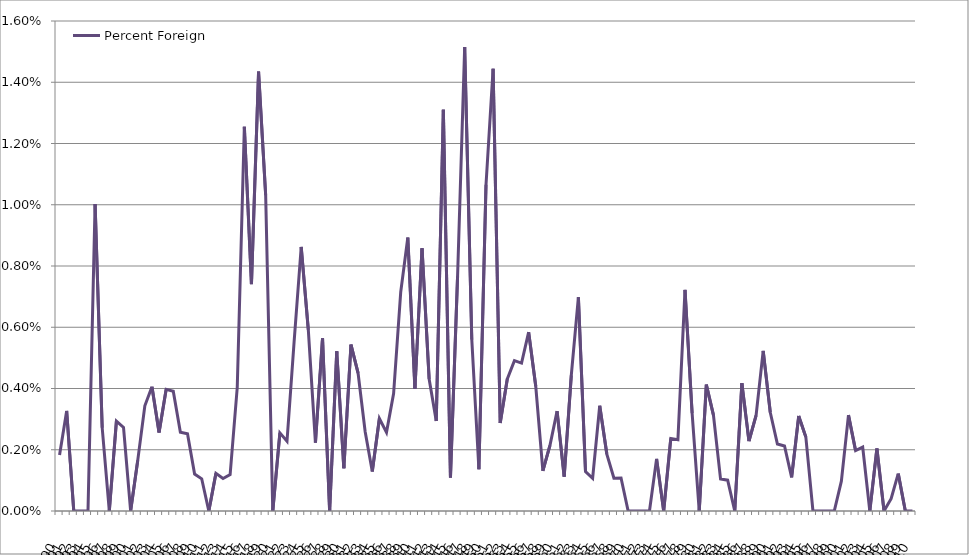
| Category | Percent Foreign |
|---|---|
| 1890.0 | 0.002 |
| 1891.0 | 0.003 |
| 1892.0 | 0 |
| 1893.0 | 0 |
| 1894.0 | 0 |
| 1895.0 | 0.01 |
| 1896.0 | 0.003 |
| 1897.0 | 0 |
| 1898.0 | 0.003 |
| 1899.0 | 0.003 |
| 1900.0 | 0 |
| 1901.0 | 0.002 |
| 1902.0 | 0.003 |
| 1903.0 | 0.004 |
| 1904.0 | 0.003 |
| 1905.0 | 0.004 |
| 1906.0 | 0.004 |
| 1907.0 | 0.003 |
| 1908.0 | 0.003 |
| 1909.0 | 0.001 |
| 1910.0 | 0.001 |
| 1911.0 | 0 |
| 1912.0 | 0.001 |
| 1913.0 | 0.001 |
| 1914.0 | 0.001 |
| 1915.0 | 0.004 |
| 1916.0 | 0.013 |
| 1917.0 | 0.007 |
| 1918.0 | 0.014 |
| 1919.0 | 0.01 |
| 1920.0 | 0 |
| 1921.0 | 0.003 |
| 1922.0 | 0.002 |
| 1923.0 | 0.006 |
| 1924.0 | 0.009 |
| 1925.0 | 0.006 |
| 1926.0 | 0.002 |
| 1927.0 | 0.006 |
| 1928.0 | 0 |
| 1929.0 | 0.005 |
| 1930.0 | 0.001 |
| 1931.0 | 0.005 |
| 1932.0 | 0.005 |
| 1933.0 | 0.003 |
| 1934.0 | 0.001 |
| 1935.0 | 0.003 |
| 1936.0 | 0.003 |
| 1937.0 | 0.004 |
| 1938.0 | 0.007 |
| 1939.0 | 0.009 |
| 1940.0 | 0.004 |
| 1941.0 | 0.009 |
| 1942.0 | 0.004 |
| 1943.0 | 0.003 |
| 1944.0 | 0.013 |
| 1945.0 | 0.001 |
| 1946.0 | 0.008 |
| 1947.0 | 0.015 |
| 1948.0 | 0.006 |
| 1949.0 | 0.001 |
| 1950.0 | 0.011 |
| 1951.0 | 0.014 |
| 1952.0 | 0.003 |
| 1953.0 | 0.004 |
| 1954.0 | 0.005 |
| 1955.0 | 0.005 |
| 1956.0 | 0.006 |
| 1957.0 | 0.004 |
| 1958.0 | 0.001 |
| 1959.0 | 0.002 |
| 1960.0 | 0.003 |
| 1961.0 | 0.001 |
| 1962.0 | 0.004 |
| 1963.0 | 0.007 |
| 1964.0 | 0.001 |
| 1965.0 | 0.001 |
| 1966.0 | 0.003 |
| 1967.0 | 0.002 |
| 1968.0 | 0.001 |
| 1969.0 | 0.001 |
| 1970.0 | 0 |
| 1971.0 | 0 |
| 1972.0 | 0 |
| 1973.0 | 0 |
| 1974.0 | 0.002 |
| 1975.0 | 0 |
| 1976.0 | 0.002 |
| 1977.0 | 0.002 |
| 1978.0 | 0.007 |
| 1979.0 | 0.003 |
| 1980.0 | 0 |
| 1981.0 | 0.004 |
| 1982.0 | 0.003 |
| 1983.0 | 0.001 |
| 1984.0 | 0.001 |
| 1985.0 | 0 |
| 1986.0 | 0.004 |
| 1987.0 | 0.002 |
| 1988.0 | 0.003 |
| 1989.0 | 0.005 |
| 1990.0 | 0.003 |
| 1991.0 | 0.002 |
| 1992.0 | 0.002 |
| 1993.0 | 0.001 |
| 1994.0 | 0.003 |
| 1995.0 | 0.002 |
| 1996.0 | 0 |
| 1997.0 | 0 |
| 1998.0 | 0 |
| 1999.0 | 0 |
| 2000.0 | 0.001 |
| 2001.0 | 0.003 |
| 2002.0 | 0.002 |
| 2003.0 | 0.002 |
| 2004.0 | 0 |
| 2005.0 | 0.002 |
| 2006.0 | 0 |
| 2007.0 | 0 |
| 2008.0 | 0.001 |
| 2009.0 | 0 |
| 2010.0 | 0 |